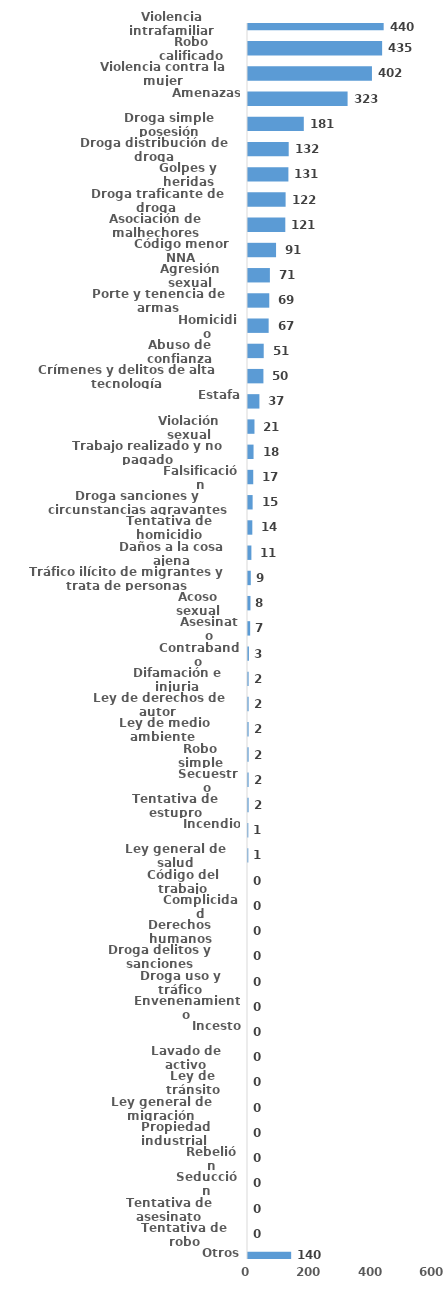
| Category | Series 0 |
|---|---|
| Violencia intrafamiliar | 440 |
| Robo calificado | 435 |
| Violencia contra la mujer | 402 |
| Amenazas | 323 |
| Droga simple posesión | 181 |
| Droga distribución de droga | 132 |
| Golpes y heridas | 131 |
| Droga traficante de droga  | 122 |
| Asociación de malhechores | 121 |
| Código menor NNA | 91 |
| Agresión sexual | 71 |
| Porte y tenencia de armas | 69 |
| Homicidio | 67 |
| Abuso de confianza | 51 |
| Crímenes y delitos de alta tecnología | 50 |
| Estafa | 37 |
| Violación sexual | 21 |
| Trabajo realizado y no pagado | 18 |
| Falsificación | 17 |
| Droga sanciones y circunstancias agravantes | 15 |
| Tentativa de homicidio | 14 |
| Daños a la cosa ajena | 11 |
| Tráfico ilícito de migrantes y trata de personas | 9 |
| Acoso sexual | 8 |
| Asesinato | 7 |
| Contrabando | 3 |
| Difamación e injuria | 2 |
| Ley de derechos de autor  | 2 |
| Ley de medio ambiente  | 2 |
| Robo simple | 2 |
| Secuestro | 2 |
| Tentativa de estupro | 2 |
| Incendio | 1 |
| Ley general de salud | 1 |
| Código del trabajo | 0 |
| Complicidad | 0 |
| Derechos humanos | 0 |
| Droga delitos y sanciones | 0 |
| Droga uso y tráfico | 0 |
| Envenenamiento | 0 |
| Incesto | 0 |
| Lavado de activo | 0 |
| Ley de tránsito | 0 |
| Ley general de migración | 0 |
| Propiedad industrial  | 0 |
| Rebelión | 0 |
| Seducción | 0 |
| Tentativa de asesinato | 0 |
| Tentativa de robo | 0 |
| Otros | 140 |